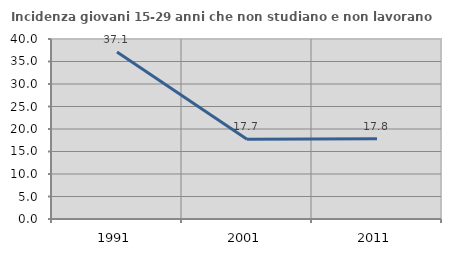
| Category | Incidenza giovani 15-29 anni che non studiano e non lavorano  |
|---|---|
| 1991.0 | 37.111 |
| 2001.0 | 17.713 |
| 2011.0 | 17.836 |